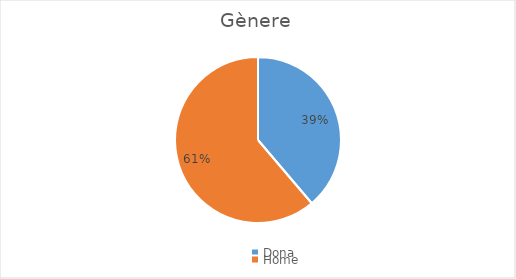
| Category | Series 0 |
|---|---|
| Dona | 45 |
| Home | 71 |